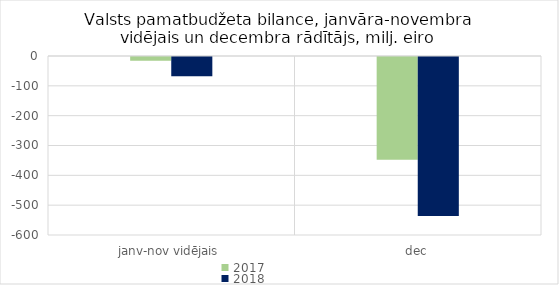
| Category | 2017 | 2018 |
|---|---|---|
| janv-nov vidējais | -12789.571 | -64462.761 |
| dec | -344358.909 | -532871.659 |